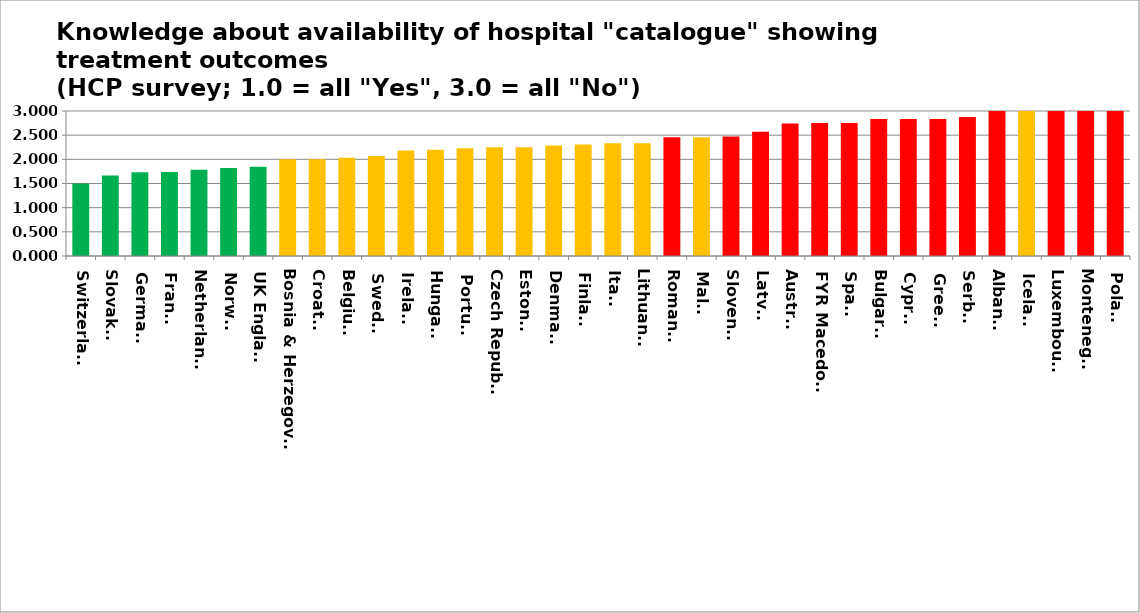
| Category | Series 0 |
|---|---|
| Switzerland | 1.5 |
| Slovakia | 1.667 |
| Germany | 1.733 |
| France | 1.738 |
| Netherlands | 1.786 |
| Norway | 1.818 |
| UK England | 1.845 |
| Bosnia & Herzegovina | 2 |
| Croatia | 2 |
| Belgium | 2.034 |
| Sweden | 2.067 |
| Ireland | 2.185 |
| Hungary | 2.197 |
| Portugal | 2.231 |
| Czech Republic | 2.25 |
| Estonia | 2.25 |
| Denmark | 2.286 |
| Finland | 2.308 |
| Italy | 2.333 |
| Lithuania | 2.333 |
| Romania | 2.455 |
| Malta | 2.458 |
| Slovenia | 2.471 |
| Latvia | 2.571 |
| Austria | 2.739 |
| FYR Macedonia | 2.75 |
| Spain | 2.75 |
| Bulgaria | 2.833 |
| Cyprus | 2.833 |
| Greece | 2.833 |
| Serbia | 2.875 |
| Albania | 3 |
| Iceland | 3 |
| Luxembourg | 3 |
| Montenegro | 3 |
| Poland | 3 |